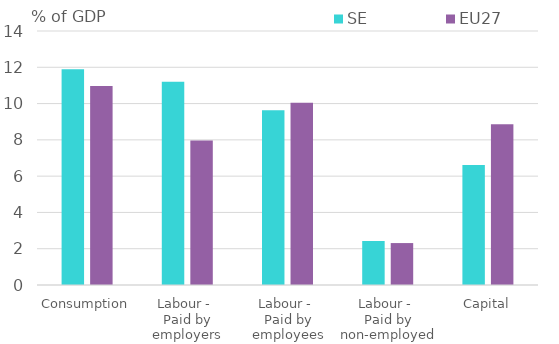
| Category | SE | EU27 |
|---|---|---|
| Consumption | 11.889 | 10.967 |
| Labour - 
Paid by employers | 11.197 | 7.966 |
| Labour - 
Paid by employees | 9.626 | 10.052 |
| Labour - 
Paid by non-employed | 2.424 | 2.311 |
| Capital | 6.611 | 8.858 |